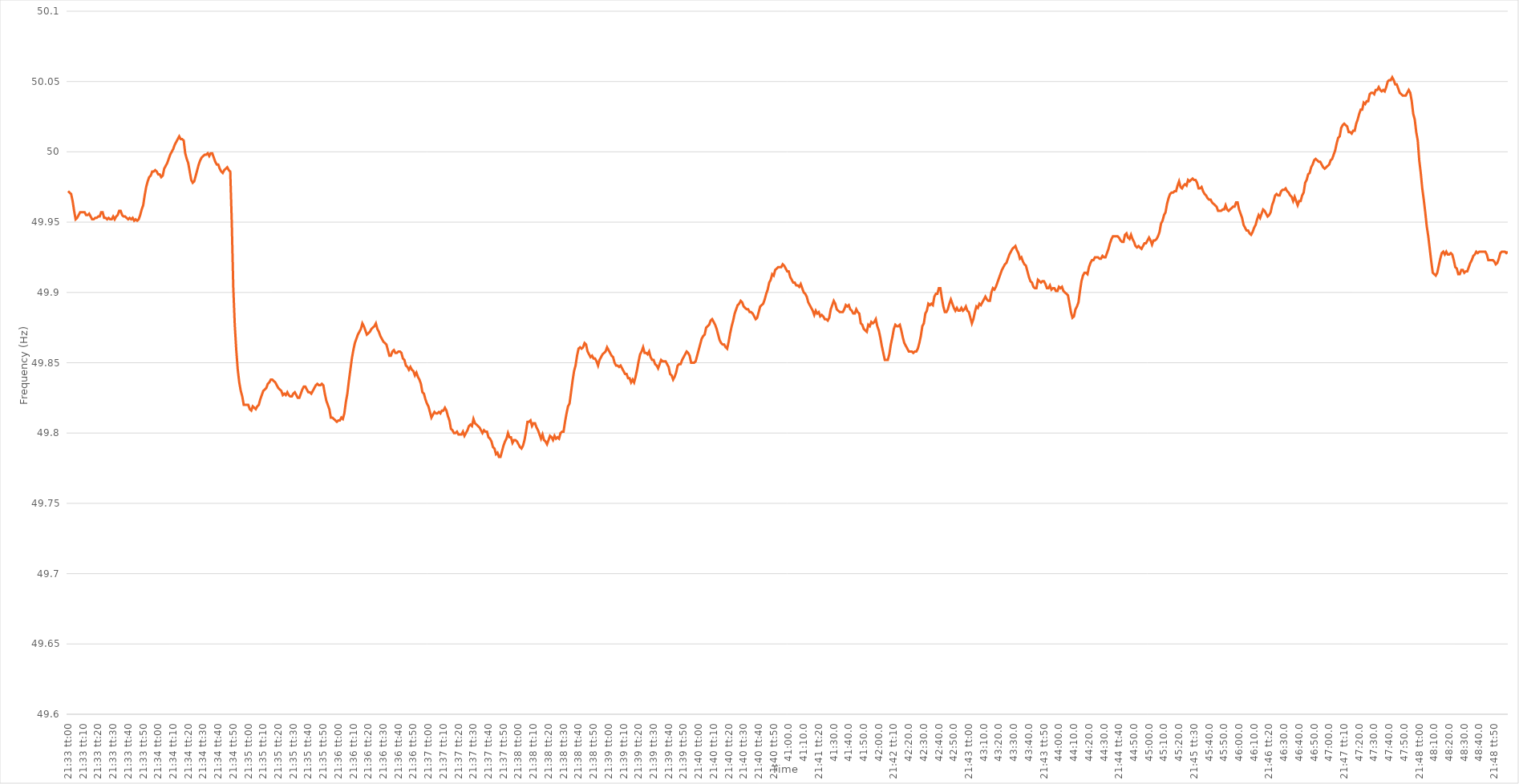
| Category | Series 0 |
|---|---|
| 0.8979166666666667 | 49.972 |
| 0.8979282407407408 | 49.971 |
| 0.8979398148148148 | 49.97 |
| 0.8979513888888889 | 49.965 |
| 0.897962962962963 | 49.958 |
| 0.897974537037037 | 49.952 |
| 0.897986111111111 | 49.953 |
| 0.8979976851851852 | 49.955 |
| 0.8980092592592593 | 49.957 |
| 0.8980208333333333 | 49.957 |
| 0.8980324074074074 | 49.957 |
| 0.8980439814814815 | 49.957 |
| 0.8980555555555556 | 49.955 |
| 0.8980671296296295 | 49.955 |
| 0.8980787037037037 | 49.956 |
| 0.8980902777777778 | 49.954 |
| 0.8981018518518519 | 49.952 |
| 0.8981134259259259 | 49.952 |
| 0.898125 | 49.953 |
| 0.8981365740740741 | 49.953 |
| 0.8981481481481483 | 49.954 |
| 0.8981597222222222 | 49.954 |
| 0.8981712962962963 | 49.957 |
| 0.8981828703703704 | 49.957 |
| 0.8981944444444444 | 49.953 |
| 0.8982060185185184 | 49.953 |
| 0.8982175925925926 | 49.952 |
| 0.8982291666666667 | 49.953 |
| 0.8982407407407407 | 49.952 |
| 0.8982523148148148 | 49.952 |
| 0.8982638888888889 | 49.954 |
| 0.898275462962963 | 49.952 |
| 0.8982870370370369 | 49.954 |
| 0.8982986111111111 | 49.955 |
| 0.8983101851851852 | 49.958 |
| 0.8983217592592593 | 49.958 |
| 0.8983333333333333 | 49.955 |
| 0.8983449074074074 | 49.954 |
| 0.8983564814814815 | 49.954 |
| 0.8983680555555557 | 49.953 |
| 0.8983796296296296 | 49.952 |
| 0.8983912037037037 | 49.953 |
| 0.8984027777777778 | 49.952 |
| 0.8984143518518519 | 49.953 |
| 0.8984259259259259 | 49.951 |
| 0.8984375 | 49.952 |
| 0.8984490740740741 | 49.951 |
| 0.8984606481481481 | 49.952 |
| 0.8984722222222222 | 49.955 |
| 0.8984837962962963 | 49.959 |
| 0.8984953703703704 | 49.962 |
| 0.8985069444444443 | 49.969 |
| 0.8985185185185185 | 49.975 |
| 0.8985300925925926 | 49.979 |
| 0.8985416666666667 | 49.982 |
| 0.8985532407407407 | 49.983 |
| 0.8985648148148148 | 49.986 |
| 0.8985763888888889 | 49.986 |
| 0.8985879629629631 | 49.987 |
| 0.898599537037037 | 49.986 |
| 0.8986111111111111 | 49.984 |
| 0.8986226851851852 | 49.984 |
| 0.8986342592592593 | 49.982 |
| 0.8986458333333333 | 49.983 |
| 0.8986574074074074 | 49.988 |
| 0.8986689814814816 | 49.99 |
| 0.8986805555555556 | 49.992 |
| 0.8986921296296296 | 49.995 |
| 0.8987037037037037 | 49.998 |
| 0.8987152777777778 | 50 |
| 0.8987268518518517 | 50.002 |
| 0.8987384259259259 | 50.005 |
| 0.89875 | 50.007 |
| 0.8987615740740741 | 50.009 |
| 0.8987731481481481 | 50.011 |
| 0.8987847222222222 | 50.009 |
| 0.8987962962962963 | 50.009 |
| 0.8988078703703705 | 50.008 |
| 0.8988194444444444 | 49.999 |
| 0.8988310185185185 | 49.995 |
| 0.8988425925925926 | 49.992 |
| 0.8988541666666667 | 49.986 |
| 0.8988657407407407 | 49.98 |
| 0.8988773148148148 | 49.978 |
| 0.898888888888889 | 49.979 |
| 0.898900462962963 | 49.983 |
| 0.898912037037037 | 49.987 |
| 0.8989236111111111 | 49.991 |
| 0.8989351851851852 | 49.994 |
| 0.8989467592592592 | 49.996 |
| 0.8989583333333333 | 49.997 |
| 0.8989699074074075 | 49.998 |
| 0.8989814814814815 | 49.998 |
| 0.8989930555555555 | 49.999 |
| 0.8990046296296296 | 49.997 |
| 0.8990162037037037 | 49.999 |
| 0.8990277777777779 | 49.999 |
| 0.8990393518518518 | 49.996 |
| 0.899050925925926 | 49.993 |
| 0.8990625 | 49.991 |
| 0.8990740740740741 | 49.991 |
| 0.8990856481481481 | 49.988 |
| 0.8990972222222222 | 49.986 |
| 0.8991087962962964 | 49.985 |
| 0.8991203703703704 | 49.987 |
| 0.8991319444444444 | 49.988 |
| 0.8991435185185185 | 49.989 |
| 0.8991550925925926 | 49.987 |
| 0.8991666666666666 | 49.986 |
| 0.8991782407407407 | 49.95 |
| 0.8991898148148149 | 49.904 |
| 0.8992013888888889 | 49.877 |
| 0.8992129629629629 | 49.859 |
| 0.899224537037037 | 49.845 |
| 0.8992361111111111 | 49.836 |
| 0.8992476851851853 | 49.83 |
| 0.8992592592592592 | 49.826 |
| 0.8992708333333334 | 49.82 |
| 0.8992824074074074 | 49.82 |
| 0.8992939814814815 | 49.82 |
| 0.8993055555555555 | 49.82 |
| 0.8993171296296296 | 49.817 |
| 0.8993287037037038 | 49.816 |
| 0.8993402777777778 | 49.819 |
| 0.8993518518518518 | 49.818 |
| 0.8993634259259259 | 49.817 |
| 0.899375 | 49.819 |
| 0.899386574074074 | 49.82 |
| 0.8993981481481481 | 49.824 |
| 0.8994097222222223 | 49.827 |
| 0.8994212962962963 | 49.83 |
| 0.8994328703703703 | 49.831 |
| 0.8994444444444444 | 49.832 |
| 0.8994560185185185 | 49.835 |
| 0.8994675925925927 | 49.836 |
| 0.8994791666666666 | 49.838 |
| 0.8994907407407408 | 49.838 |
| 0.8995023148148148 | 49.837 |
| 0.899513888888889 | 49.836 |
| 0.8995254629629629 | 49.834 |
| 0.899537037037037 | 49.832 |
| 0.8995486111111112 | 49.831 |
| 0.8995601851851852 | 49.83 |
| 0.8995717592592593 | 49.827 |
| 0.8995833333333333 | 49.828 |
| 0.8995949074074074 | 49.827 |
| 0.8996064814814814 | 49.829 |
| 0.8996180555555555 | 49.827 |
| 0.8996296296296297 | 49.826 |
| 0.8996412037037037 | 49.826 |
| 0.8996527777777777 | 49.828 |
| 0.8996643518518518 | 49.829 |
| 0.8996759259259259 | 49.827 |
| 0.8996875000000001 | 49.825 |
| 0.899699074074074 | 49.825 |
| 0.8997106481481482 | 49.828 |
| 0.8997222222222222 | 49.831 |
| 0.8997337962962964 | 49.833 |
| 0.8997453703703703 | 49.833 |
| 0.8997569444444444 | 49.831 |
| 0.8997685185185186 | 49.829 |
| 0.8997800925925926 | 49.829 |
| 0.8997916666666667 | 49.828 |
| 0.8998032407407407 | 49.83 |
| 0.8998148148148148 | 49.832 |
| 0.899826388888889 | 49.834 |
| 0.8998379629629629 | 49.835 |
| 0.8998495370370371 | 49.834 |
| 0.8998611111111111 | 49.834 |
| 0.8998726851851853 | 49.835 |
| 0.8998842592592592 | 49.834 |
| 0.8998958333333333 | 49.828 |
| 0.8999074074074075 | 49.823 |
| 0.8999189814814814 | 49.82 |
| 0.8999305555555556 | 49.817 |
| 0.8999421296296296 | 49.811 |
| 0.8999537037037038 | 49.811 |
| 0.8999652777777777 | 49.81 |
| 0.8999768518518518 | 49.809 |
| 0.899988425925926 | 49.808 |
| 0.9 | 49.809 |
| 0.9000115740740741 | 49.809 |
| 0.9000231481481481 | 49.811 |
| 0.9000347222222222 | 49.81 |
| 0.9000462962962964 | 49.814 |
| 0.9000578703703703 | 49.822 |
| 0.9000694444444445 | 49.828 |
| 0.9000810185185185 | 49.837 |
| 0.9000925925925927 | 49.845 |
| 0.9001041666666666 | 49.853 |
| 0.9001157407407407 | 49.859 |
| 0.9001273148148149 | 49.864 |
| 0.9001388888888888 | 49.867 |
| 0.900150462962963 | 49.87 |
| 0.900162037037037 | 49.872 |
| 0.9001736111111112 | 49.874 |
| 0.9001851851851851 | 49.878 |
| 0.9001967592592592 | 49.876 |
| 0.9002083333333334 | 49.873 |
| 0.9002199074074074 | 49.87 |
| 0.9002314814814815 | 49.871 |
| 0.9002430555555555 | 49.872 |
| 0.9002546296296297 | 49.874 |
| 0.9002662037037038 | 49.875 |
| 0.9002777777777777 | 49.876 |
| 0.9002893518518519 | 49.878 |
| 0.9003009259259259 | 49.874 |
| 0.9003125000000001 | 49.872 |
| 0.900324074074074 | 49.869 |
| 0.9003356481481481 | 49.867 |
| 0.9003472222222223 | 49.865 |
| 0.9003587962962962 | 49.864 |
| 0.9003703703703704 | 49.863 |
| 0.9003819444444444 | 49.859 |
| 0.9003935185185186 | 49.855 |
| 0.9004050925925925 | 49.855 |
| 0.9004166666666666 | 49.858 |
| 0.9004282407407408 | 49.859 |
| 0.9004398148148148 | 49.857 |
| 0.9004513888888889 | 49.857 |
| 0.9004629629629629 | 49.858 |
| 0.9004745370370371 | 49.858 |
| 0.9004861111111112 | 49.857 |
| 0.9004976851851851 | 49.853 |
| 0.9005092592592593 | 49.852 |
| 0.9005208333333333 | 49.848 |
| 0.9005324074074075 | 49.847 |
| 0.9005439814814814 | 49.845 |
| 0.9005555555555556 | 49.847 |
| 0.9005671296296297 | 49.845 |
| 0.9005787037037036 | 49.844 |
| 0.9005902777777778 | 49.841 |
| 0.9006018518518518 | 49.843 |
| 0.900613425925926 | 49.84 |
| 0.9006249999999999 | 49.838 |
| 0.900636574074074 | 49.835 |
| 0.9006481481481482 | 49.829 |
| 0.9006597222222222 | 49.828 |
| 0.9006712962962963 | 49.824 |
| 0.9006828703703703 | 49.821 |
| 0.9006944444444445 | 49.819 |
| 0.9007060185185186 | 49.815 |
| 0.9007175925925925 | 49.811 |
| 0.9007291666666667 | 49.813 |
| 0.9007407407407407 | 49.815 |
| 0.9007523148148149 | 49.814 |
| 0.9007638888888888 | 49.814 |
| 0.900775462962963 | 49.815 |
| 0.9007870370370371 | 49.814 |
| 0.900798611111111 | 49.816 |
| 0.9008101851851852 | 49.816 |
| 0.9008217592592592 | 49.818 |
| 0.9008333333333334 | 49.816 |
| 0.9008449074074073 | 49.812 |
| 0.9008564814814815 | 49.809 |
| 0.9008680555555556 | 49.803 |
| 0.9008796296296296 | 49.802 |
| 0.9008912037037037 | 49.8 |
| 0.9009027777777777 | 49.8 |
| 0.9009143518518519 | 49.801 |
| 0.900925925925926 | 49.799 |
| 0.9009375 | 49.799 |
| 0.9009490740740741 | 49.799 |
| 0.9009606481481481 | 49.801 |
| 0.9009722222222223 | 49.798 |
| 0.9009837962962962 | 49.8 |
| 0.9009953703703704 | 49.802 |
| 0.9010069444444445 | 49.805 |
| 0.9010185185185186 | 49.806 |
| 0.9010300925925926 | 49.805 |
| 0.9010416666666666 | 49.81 |
| 0.9010532407407408 | 49.807 |
| 0.9010648148148147 | 49.806 |
| 0.9010763888888889 | 49.805 |
| 0.901087962962963 | 49.804 |
| 0.901099537037037 | 49.802 |
| 0.9011111111111111 | 49.8 |
| 0.9011226851851851 | 49.802 |
| 0.9011342592592593 | 49.801 |
| 0.9011458333333334 | 49.801 |
| 0.9011574074074074 | 49.797 |
| 0.9011689814814815 | 49.796 |
| 0.9011805555555555 | 49.794 |
| 0.9011921296296297 | 49.79 |
| 0.9012037037037036 | 49.789 |
| 0.9012152777777778 | 49.785 |
| 0.9012268518518519 | 49.786 |
| 0.901238425925926 | 49.783 |
| 0.90125 | 49.783 |
| 0.901261574074074 | 49.787 |
| 0.9012731481481482 | 49.791 |
| 0.9012847222222223 | 49.794 |
| 0.9012962962962963 | 49.796 |
| 0.9013078703703704 | 49.8 |
| 0.9013194444444445 | 49.797 |
| 0.9013310185185185 | 49.797 |
| 0.9013425925925925 | 49.793 |
| 0.9013541666666667 | 49.795 |
| 0.9013657407407408 | 49.795 |
| 0.9013773148148148 | 49.794 |
| 0.9013888888888889 | 49.792 |
| 0.901400462962963 | 49.79 |
| 0.9014120370370371 | 49.789 |
| 0.901423611111111 | 49.791 |
| 0.9014351851851852 | 49.795 |
| 0.9014467592592593 | 49.801 |
| 0.9014583333333334 | 49.808 |
| 0.9014699074074074 | 49.808 |
| 0.9014814814814814 | 49.809 |
| 0.9014930555555556 | 49.805 |
| 0.9015046296296297 | 49.807 |
| 0.9015162037037037 | 49.807 |
| 0.9015277777777778 | 49.804 |
| 0.9015393518518519 | 49.802 |
| 0.9015509259259259 | 49.799 |
| 0.9015624999999999 | 49.796 |
| 0.9015740740740741 | 49.799 |
| 0.9015856481481482 | 49.795 |
| 0.9015972222222222 | 49.794 |
| 0.9016087962962963 | 49.792 |
| 0.9016203703703703 | 49.795 |
| 0.9016319444444445 | 49.798 |
| 0.9016435185185184 | 49.797 |
| 0.9016550925925926 | 49.795 |
| 0.9016666666666667 | 49.798 |
| 0.9016782407407408 | 49.796 |
| 0.9016898148148148 | 49.797 |
| 0.9017013888888888 | 49.796 |
| 0.901712962962963 | 49.8 |
| 0.9017245370370371 | 49.801 |
| 0.9017361111111111 | 49.801 |
| 0.9017476851851852 | 49.808 |
| 0.9017592592592593 | 49.814 |
| 0.9017708333333333 | 49.819 |
| 0.9017824074074073 | 49.821 |
| 0.9017939814814815 | 49.829 |
| 0.9018055555555556 | 49.837 |
| 0.9018171296296296 | 49.844 |
| 0.9018287037037037 | 49.848 |
| 0.9018402777777778 | 49.855 |
| 0.9018518518518519 | 49.86 |
| 0.9018634259259258 | 49.861 |
| 0.901875 | 49.86 |
| 0.9018865740740741 | 49.861 |
| 0.9018981481481482 | 49.864 |
| 0.9019097222222222 | 49.863 |
| 0.9019212962962962 | 49.858 |
| 0.9019328703703704 | 49.856 |
| 0.9019444444444445 | 49.854 |
| 0.9019560185185185 | 49.855 |
| 0.9019675925925926 | 49.853 |
| 0.9019791666666667 | 49.853 |
| 0.9019907407407407 | 49.851 |
| 0.9020023148148147 | 49.848 |
| 0.9020138888888889 | 49.852 |
| 0.902025462962963 | 49.854 |
| 0.902037037037037 | 49.856 |
| 0.9020486111111111 | 49.857 |
| 0.9020601851851852 | 49.858 |
| 0.9020717592592593 | 49.861 |
| 0.9020833333333332 | 49.859 |
| 0.9020949074074074 | 49.857 |
| 0.9021064814814815 | 49.855 |
| 0.9021180555555556 | 49.854 |
| 0.9021296296296296 | 49.85 |
| 0.9021412037037037 | 49.848 |
| 0.9021527777777778 | 49.848 |
| 0.902164351851852 | 49.847 |
| 0.9021759259259259 | 49.848 |
| 0.9021875 | 49.846 |
| 0.9021990740740741 | 49.844 |
| 0.9022106481481481 | 49.842 |
| 0.9022222222222221 | 49.842 |
| 0.9022337962962963 | 49.839 |
| 0.9022453703703704 | 49.839 |
| 0.9022569444444444 | 49.836 |
| 0.9022685185185185 | 49.838 |
| 0.9022800925925926 | 49.836 |
| 0.9022916666666667 | 49.84 |
| 0.9023032407407406 | 49.845 |
| 0.9023148148148148 | 49.851 |
| 0.9023263888888889 | 49.856 |
| 0.902337962962963 | 49.858 |
| 0.902349537037037 | 49.861 |
| 0.9023611111111111 | 49.857 |
| 0.9023726851851852 | 49.857 |
| 0.9023842592592594 | 49.856 |
| 0.9023958333333333 | 49.858 |
| 0.9024074074074074 | 49.854 |
| 0.9024189814814815 | 49.852 |
| 0.9024305555555556 | 49.852 |
| 0.9024421296296296 | 49.849 |
| 0.9024537037037037 | 49.848 |
| 0.9024652777777779 | 49.846 |
| 0.9024768518518519 | 49.849 |
| 0.9024884259259259 | 49.852 |
| 0.9025 | 49.851 |
| 0.9025115740740741 | 49.851 |
| 0.902523148148148 | 49.851 |
| 0.9025347222222222 | 49.849 |
| 0.9025462962962963 | 49.847 |
| 0.9025578703703704 | 49.842 |
| 0.9025694444444444 | 49.841 |
| 0.9025810185185185 | 49.838 |
| 0.9025925925925926 | 49.84 |
| 0.9026041666666668 | 49.843 |
| 0.9026157407407407 | 49.848 |
| 0.9026273148148148 | 49.849 |
| 0.9026388888888889 | 49.849 |
| 0.902650462962963 | 49.852 |
| 0.902662037037037 | 49.854 |
| 0.9026736111111111 | 49.856 |
| 0.9026851851851853 | 49.858 |
| 0.9026967592592593 | 49.857 |
| 0.9027083333333333 | 49.855 |
| 0.9027199074074074 | 49.85 |
| 0.9027314814814815 | 49.85 |
| 0.9027430555555555 | 49.85 |
| 0.9027546296296296 | 49.851 |
| 0.9027662037037038 | 49.855 |
| 0.9027777777777778 | 49.859 |
| 0.9027893518518518 | 49.863 |
| 0.9028009259259259 | 49.867 |
| 0.9028125 | 49.869 |
| 0.9028240740740742 | 49.87 |
| 0.9028356481481481 | 49.875 |
| 0.9028472222222222 | 49.876 |
| 0.9028587962962963 | 49.877 |
| 0.9028703703703704 | 49.88 |
| 0.9028819444444444 | 49.881 |
| 0.9028935185185185 | 49.879 |
| 0.9029050925925927 | 49.877 |
| 0.9029166666666667 | 49.874 |
| 0.9029282407407407 | 49.87 |
| 0.9029398148148148 | 49.866 |
| 0.9029513888888889 | 49.864 |
| 0.9029629629629629 | 49.863 |
| 0.902974537037037 | 49.863 |
| 0.9029861111111112 | 49.861 |
| 0.9029976851851852 | 49.86 |
| 0.9030092592592592 | 49.865 |
| 0.9030208333333333 | 49.871 |
| 0.9030324074074074 | 49.876 |
| 0.9030439814814816 | 49.88 |
| 0.9030555555555555 | 49.885 |
| 0.9030671296296297 | 49.888 |
| 0.9030787037037037 | 49.891 |
| 0.9030902777777778 | 49.892 |
| 0.9031018518518518 | 49.894 |
| 0.9031134259259259 | 49.893 |
| 0.9031250000000001 | 49.89 |
| 0.9031365740740741 | 49.889 |
| 0.9031481481481481 | 49.888 |
| 0.9031597222222222 | 49.888 |
| 0.9031712962962963 | 49.886 |
| 0.9031828703703703 | 49.886 |
| 0.9031944444444444 | 49.885 |
| 0.9032060185185186 | 49.883 |
| 0.9032175925925926 | 49.881 |
| 0.9032291666666666 | 49.882 |
| 0.9032407407407407 | 49.886 |
| 0.9032523148148148 | 49.89 |
| 0.903263888888889 | 49.891 |
| 0.9032754629629629 | 49.892 |
| 0.903287037037037 | 49.895 |
| 0.9032986111111111 | 49.899 |
| 0.9033101851851852 | 49.902 |
| 0.9033217592592592 | 49.907 |
| 0.9033333333333333 | 49.909 |
| 0.9033449074074075 | 49.913 |
| 0.9033564814814815 | 49.912 |
| 0.9033680555555555 | 49.916 |
| 0.9033796296296296 | 49.917 |
| 0.9033912037037037 | 49.918 |
| 0.9034027777777777 | 49.918 |
| 0.9034143518518518 | 49.918 |
| 0.903425925925926 | 49.92 |
| 0.9034375 | 49.919 |
| 0.903449074074074 | 49.917 |
| 0.9034606481481481 | 49.915 |
| 0.9034722222222222 | 49.915 |
| 0.9034837962962964 | 49.911 |
| 0.9034953703703703 | 49.909 |
| 0.9035069444444445 | 49.907 |
| 0.9035185185185185 | 49.907 |
| 0.9035300925925926 | 49.905 |
| 0.9035416666666666 | 49.905 |
| 0.9035532407407407 | 49.904 |
| 0.9035648148148149 | 49.906 |
| 0.9035763888888889 | 49.903 |
| 0.903587962962963 | 49.9 |
| 0.903599537037037 | 49.899 |
| 0.9036111111111111 | 49.897 |
| 0.9036226851851853 | 49.893 |
| 0.9036342592592592 | 49.891 |
| 0.9036458333333334 | 49.889 |
| 0.9036574074074074 | 49.887 |
| 0.9036689814814814 | 49.884 |
| 0.9036805555555555 | 49.887 |
| 0.9036921296296296 | 49.885 |
| 0.9037037037037038 | 49.886 |
| 0.9037152777777777 | 49.883 |
| 0.9037268518518519 | 49.884 |
| 0.9037384259259259 | 49.883 |
| 0.90375 | 49.881 |
| 0.903761574074074 | 49.881 |
| 0.9037731481481481 | 49.88 |
| 0.9037847222222223 | 49.882 |
| 0.9037962962962963 | 49.888 |
| 0.9038078703703704 | 49.891 |
| 0.9038194444444444 | 49.894 |
| 0.9038310185185185 | 49.892 |
| 0.9038425925925927 | 49.888 |
| 0.9038541666666666 | 49.887 |
| 0.9038657407407408 | 49.886 |
| 0.9038773148148148 | 49.886 |
| 0.903888888888889 | 49.886 |
| 0.9039004629629629 | 49.888 |
| 0.903912037037037 | 49.891 |
| 0.9039236111111112 | 49.89 |
| 0.9039351851851851 | 49.891 |
| 0.9039467592592593 | 49.888 |
| 0.9039583333333333 | 49.887 |
| 0.9039699074074075 | 49.885 |
| 0.9039814814814814 | 49.885 |
| 0.9039930555555555 | 49.888 |
| 0.9040046296296297 | 49.886 |
| 0.9040162037037037 | 49.885 |
| 0.9040277777777778 | 49.878 |
| 0.9040393518518518 | 49.877 |
| 0.904050925925926 | 49.874 |
| 0.9040625000000001 | 49.873 |
| 0.904074074074074 | 49.872 |
| 0.9040856481481482 | 49.877 |
| 0.9040972222222222 | 49.876 |
| 0.9041087962962964 | 49.879 |
| 0.9041203703703703 | 49.878 |
| 0.9041319444444444 | 49.879 |
| 0.9041435185185186 | 49.881 |
| 0.9041550925925925 | 49.876 |
| 0.9041666666666667 | 49.873 |
| 0.9041782407407407 | 49.868 |
| 0.9041898148148149 | 49.862 |
| 0.9042013888888888 | 49.857 |
| 0.9042129629629629 | 49.852 |
| 0.9042245370370371 | 49.852 |
| 0.9042361111111111 | 49.852 |
| 0.9042476851851852 | 49.856 |
| 0.9042592592592592 | 49.863 |
| 0.9042708333333334 | 49.868 |
| 0.9042824074074075 | 49.874 |
| 0.9042939814814814 | 49.877 |
| 0.9043055555555556 | 49.876 |
| 0.9043171296296296 | 49.876 |
| 0.9043287037037038 | 49.877 |
| 0.9043402777777777 | 49.873 |
| 0.9043518518518519 | 49.868 |
| 0.904363425925926 | 49.864 |
| 0.9043749999999999 | 49.862 |
| 0.9043865740740741 | 49.86 |
| 0.9043981481481481 | 49.858 |
| 0.9044097222222223 | 49.858 |
| 0.9044212962962962 | 49.858 |
| 0.9044328703703703 | 49.857 |
| 0.9044444444444445 | 49.858 |
| 0.9044560185185185 | 49.858 |
| 0.9044675925925926 | 49.86 |
| 0.9044791666666666 | 49.864 |
| 0.9044907407407408 | 49.869 |
| 0.9045023148148149 | 49.876 |
| 0.9045138888888888 | 49.878 |
| 0.904525462962963 | 49.885 |
| 0.904537037037037 | 49.887 |
| 0.9045486111111112 | 49.892 |
| 0.9045601851851851 | 49.891 |
| 0.9045717592592593 | 49.892 |
| 0.9045833333333334 | 49.891 |
| 0.9045949074074073 | 49.897 |
| 0.9046064814814815 | 49.899 |
| 0.9046180555555555 | 49.899 |
| 0.9046296296296297 | 49.903 |
| 0.9046412037037036 | 49.903 |
| 0.9046527777777778 | 49.896 |
| 0.9046643518518519 | 49.89 |
| 0.9046759259259259 | 49.886 |
| 0.9046875 | 49.886 |
| 0.904699074074074 | 49.888 |
| 0.9047106481481482 | 49.892 |
| 0.9047222222222223 | 49.895 |
| 0.9047337962962962 | 49.892 |
| 0.9047453703703704 | 49.889 |
| 0.9047569444444444 | 49.887 |
| 0.9047685185185186 | 49.889 |
| 0.9047800925925925 | 49.887 |
| 0.9047916666666667 | 49.887 |
| 0.9048032407407408 | 49.889 |
| 0.9048148148148147 | 49.887 |
| 0.9048263888888889 | 49.888 |
| 0.9048379629629629 | 49.89 |
| 0.9048495370370371 | 49.887 |
| 0.904861111111111 | 49.886 |
| 0.9048726851851852 | 49.882 |
| 0.9048842592592593 | 49.878 |
| 0.9048958333333333 | 49.881 |
| 0.9049074074074074 | 49.886 |
| 0.9049189814814814 | 49.89 |
| 0.9049305555555556 | 49.889 |
| 0.9049421296296297 | 49.892 |
| 0.9049537037037036 | 49.891 |
| 0.9049652777777778 | 49.893 |
| 0.9049768518518518 | 49.895 |
| 0.904988425925926 | 49.897 |
| 0.9049999999999999 | 49.895 |
| 0.9050115740740741 | 49.894 |
| 0.9050231481481482 | 49.894 |
| 0.9050347222222223 | 49.9 |
| 0.9050462962962963 | 49.903 |
| 0.9050578703703703 | 49.902 |
| 0.9050694444444445 | 49.904 |
| 0.9050810185185186 | 49.907 |
| 0.9050925925925926 | 49.91 |
| 0.9051041666666667 | 49.913 |
| 0.9051157407407407 | 49.916 |
| 0.9051273148148148 | 49.918 |
| 0.9051388888888888 | 49.92 |
| 0.905150462962963 | 49.921 |
| 0.9051620370370371 | 49.924 |
| 0.905173611111111 | 49.927 |
| 0.9051851851851852 | 49.929 |
| 0.9051967592592592 | 49.931 |
| 0.9052083333333334 | 49.932 |
| 0.9052199074074073 | 49.933 |
| 0.9052314814814815 | 49.93 |
| 0.9052430555555556 | 49.928 |
| 0.9052546296296297 | 49.924 |
| 0.9052662037037037 | 49.925 |
| 0.9052777777777777 | 49.922 |
| 0.9052893518518519 | 49.92 |
| 0.905300925925926 | 49.919 |
| 0.9053125 | 49.915 |
| 0.9053240740740741 | 49.911 |
| 0.9053356481481482 | 49.908 |
| 0.9053472222222222 | 49.907 |
| 0.9053587962962962 | 49.904 |
| 0.9053703703703704 | 49.903 |
| 0.9053819444444445 | 49.903 |
| 0.9053935185185185 | 49.909 |
| 0.9054050925925926 | 49.908 |
| 0.9054166666666666 | 49.907 |
| 0.9054282407407408 | 49.908 |
| 0.9054398148148147 | 49.908 |
| 0.9054513888888889 | 49.906 |
| 0.905462962962963 | 49.903 |
| 0.9054745370370371 | 49.903 |
| 0.9054861111111111 | 49.905 |
| 0.9054976851851851 | 49.902 |
| 0.9055092592592593 | 49.903 |
| 0.9055208333333334 | 49.903 |
| 0.9055324074074074 | 49.901 |
| 0.9055439814814815 | 49.901 |
| 0.9055555555555556 | 49.904 |
| 0.9055671296296296 | 49.903 |
| 0.9055787037037036 | 49.904 |
| 0.9055902777777778 | 49.901 |
| 0.9056018518518519 | 49.9 |
| 0.9056134259259259 | 49.899 |
| 0.905625 | 49.898 |
| 0.905636574074074 | 49.892 |
| 0.9056481481481482 | 49.886 |
| 0.9056597222222221 | 49.882 |
| 0.9056712962962963 | 49.883 |
| 0.9056828703703704 | 49.888 |
| 0.9056944444444445 | 49.89 |
| 0.9057060185185185 | 49.893 |
| 0.9057175925925925 | 49.901 |
| 0.9057291666666667 | 49.908 |
| 0.9057407407407408 | 49.912 |
| 0.9057523148148148 | 49.914 |
| 0.9057638888888889 | 49.914 |
| 0.905775462962963 | 49.913 |
| 0.905787037037037 | 49.918 |
| 0.905798611111111 | 49.921 |
| 0.9058101851851852 | 49.923 |
| 0.9058217592592593 | 49.923 |
| 0.9058333333333333 | 49.925 |
| 0.9058449074074074 | 49.925 |
| 0.9058564814814815 | 49.925 |
| 0.9058680555555556 | 49.924 |
| 0.9058796296296295 | 49.924 |
| 0.9058912037037037 | 49.926 |
| 0.9059027777777778 | 49.925 |
| 0.9059143518518519 | 49.925 |
| 0.9059259259259259 | 49.928 |
| 0.9059375 | 49.931 |
| 0.9059490740740741 | 49.935 |
| 0.9059606481481483 | 49.938 |
| 0.9059722222222222 | 49.94 |
| 0.9059837962962963 | 49.94 |
| 0.9059953703703704 | 49.94 |
| 0.9060069444444444 | 49.94 |
| 0.9060185185185184 | 49.939 |
| 0.9060300925925926 | 49.937 |
| 0.9060416666666667 | 49.936 |
| 0.9060532407407407 | 49.936 |
| 0.9060648148148148 | 49.941 |
| 0.9060763888888889 | 49.942 |
| 0.906087962962963 | 49.939 |
| 0.9060995370370369 | 49.938 |
| 0.9061111111111111 | 49.941 |
| 0.9061226851851852 | 49.938 |
| 0.9061342592592593 | 49.936 |
| 0.9061458333333333 | 49.933 |
| 0.9061574074074074 | 49.932 |
| 0.9061689814814815 | 49.933 |
| 0.9061805555555557 | 49.932 |
| 0.9061921296296296 | 49.931 |
| 0.9062037037037037 | 49.933 |
| 0.9062152777777778 | 49.935 |
| 0.9062268518518519 | 49.935 |
| 0.9062384259259259 | 49.937 |
| 0.90625 | 49.939 |
| 0.9062615740740741 | 49.937 |
| 0.9062731481481481 | 49.934 |
| 0.9062847222222222 | 49.937 |
| 0.9062962962962963 | 49.937 |
| 0.9063078703703704 | 49.938 |
| 0.9063194444444443 | 49.94 |
| 0.9063310185185185 | 49.943 |
| 0.9063425925925926 | 49.949 |
| 0.9063541666666667 | 49.951 |
| 0.9063657407407407 | 49.955 |
| 0.9063773148148148 | 49.957 |
| 0.9063888888888889 | 49.963 |
| 0.9064004629629631 | 49.967 |
| 0.906412037037037 | 49.97 |
| 0.9064236111111111 | 49.971 |
| 0.9064351851851852 | 49.971 |
| 0.9064467592592593 | 49.972 |
| 0.9064583333333333 | 49.972 |
| 0.9064699074074074 | 49.976 |
| 0.9064814814814816 | 49.979 |
| 0.9064930555555556 | 49.975 |
| 0.9065046296296296 | 49.974 |
| 0.9065162037037037 | 49.976 |
| 0.9065277777777778 | 49.977 |
| 0.9065393518518517 | 49.976 |
| 0.9065509259259259 | 49.98 |
| 0.9065625 | 49.979 |
| 0.9065740740740741 | 49.98 |
| 0.9065856481481481 | 49.981 |
| 0.9065972222222222 | 49.98 |
| 0.9066087962962963 | 49.98 |
| 0.9066203703703705 | 49.978 |
| 0.9066319444444444 | 49.974 |
| 0.9066435185185185 | 49.974 |
| 0.9066550925925926 | 49.975 |
| 0.9066666666666667 | 49.972 |
| 0.9066782407407407 | 49.97 |
| 0.9066898148148148 | 49.969 |
| 0.906701388888889 | 49.967 |
| 0.906712962962963 | 49.966 |
| 0.906724537037037 | 49.966 |
| 0.9067361111111111 | 49.964 |
| 0.9067476851851852 | 49.963 |
| 0.9067592592592592 | 49.962 |
| 0.9067708333333333 | 49.961 |
| 0.9067824074074075 | 49.958 |
| 0.9067939814814815 | 49.958 |
| 0.9068055555555555 | 49.958 |
| 0.9068171296296296 | 49.959 |
| 0.9068287037037037 | 49.959 |
| 0.9068402777777779 | 49.962 |
| 0.9068518518518518 | 49.959 |
| 0.906863425925926 | 49.958 |
| 0.906875 | 49.959 |
| 0.9068865740740741 | 49.96 |
| 0.9068981481481481 | 49.961 |
| 0.9069097222222222 | 49.961 |
| 0.9069212962962964 | 49.964 |
| 0.9069328703703704 | 49.964 |
| 0.9069444444444444 | 49.959 |
| 0.9069560185185185 | 49.956 |
| 0.9069675925925926 | 49.953 |
| 0.9069791666666666 | 49.948 |
| 0.9069907407407407 | 49.946 |
| 0.9070023148148149 | 49.944 |
| 0.9070138888888889 | 49.944 |
| 0.9070254629629629 | 49.942 |
| 0.907037037037037 | 49.941 |
| 0.9070486111111111 | 49.943 |
| 0.9070601851851853 | 49.946 |
| 0.9070717592592592 | 49.948 |
| 0.9070833333333334 | 49.952 |
| 0.9070949074074074 | 49.955 |
| 0.9071064814814815 | 49.953 |
| 0.9071180555555555 | 49.956 |
| 0.9071296296296296 | 49.959 |
| 0.9071412037037038 | 49.958 |
| 0.9071527777777778 | 49.956 |
| 0.9071643518518518 | 49.954 |
| 0.9071759259259259 | 49.955 |
| 0.9071875 | 49.957 |
| 0.907199074074074 | 49.962 |
| 0.9072106481481481 | 49.965 |
| 0.9072222222222223 | 49.969 |
| 0.9072337962962963 | 49.97 |
| 0.9072453703703703 | 49.969 |
| 0.9072569444444444 | 49.969 |
| 0.9072685185185185 | 49.972 |
| 0.9072800925925927 | 49.973 |
| 0.9072916666666666 | 49.973 |
| 0.9073032407407408 | 49.974 |
| 0.9073148148148148 | 49.972 |
| 0.907326388888889 | 49.971 |
| 0.9073379629629629 | 49.969 |
| 0.907349537037037 | 49.968 |
| 0.9073611111111112 | 49.965 |
| 0.9073726851851852 | 49.968 |
| 0.9073842592592593 | 49.965 |
| 0.9073958333333333 | 49.962 |
| 0.9074074074074074 | 49.965 |
| 0.9074189814814814 | 49.965 |
| 0.9074305555555555 | 49.969 |
| 0.9074421296296297 | 49.971 |
| 0.9074537037037037 | 49.978 |
| 0.9074652777777777 | 49.98 |
| 0.9074768518518518 | 49.984 |
| 0.9074884259259259 | 49.985 |
| 0.9075000000000001 | 49.989 |
| 0.907511574074074 | 49.991 |
| 0.9075231481481482 | 49.994 |
| 0.9075347222222222 | 49.995 |
| 0.9075462962962964 | 49.994 |
| 0.9075578703703703 | 49.993 |
| 0.9075694444444444 | 49.993 |
| 0.9075810185185186 | 49.991 |
| 0.9075925925925926 | 49.989 |
| 0.9076041666666667 | 49.988 |
| 0.9076157407407407 | 49.989 |
| 0.9076273148148148 | 49.99 |
| 0.907638888888889 | 49.991 |
| 0.9076504629629629 | 49.994 |
| 0.9076620370370371 | 49.995 |
| 0.9076736111111111 | 49.998 |
| 0.9076851851851853 | 50.001 |
| 0.9076967592592592 | 50.006 |
| 0.9077083333333333 | 50.01 |
| 0.9077199074074075 | 50.011 |
| 0.9077314814814814 | 50.017 |
| 0.9077430555555556 | 50.019 |
| 0.9077546296296296 | 50.02 |
| 0.9077662037037038 | 50.019 |
| 0.9077777777777777 | 50.018 |
| 0.9077893518518518 | 50.014 |
| 0.907800925925926 | 50.014 |
| 0.9078125 | 50.013 |
| 0.9078240740740741 | 50.015 |
| 0.9078356481481481 | 50.015 |
| 0.9078472222222222 | 50.02 |
| 0.9078587962962964 | 50.023 |
| 0.9078703703703703 | 50.027 |
| 0.9078819444444445 | 50.03 |
| 0.9078935185185185 | 50.03 |
| 0.9079050925925927 | 50.035 |
| 0.9079166666666666 | 50.034 |
| 0.9079282407407407 | 50.036 |
| 0.9079398148148149 | 50.036 |
| 0.9079513888888888 | 50.041 |
| 0.907962962962963 | 50.042 |
| 0.907974537037037 | 50.042 |
| 0.9079861111111112 | 50.041 |
| 0.9079976851851851 | 50.044 |
| 0.9080092592592592 | 50.044 |
| 0.9080208333333334 | 50.046 |
| 0.9080324074074074 | 50.044 |
| 0.9080439814814815 | 50.043 |
| 0.9080555555555555 | 50.044 |
| 0.9080671296296297 | 50.043 |
| 0.9080787037037038 | 50.046 |
| 0.9080902777777777 | 50.05 |
| 0.9081018518518519 | 50.051 |
| 0.9081134259259259 | 50.051 |
| 0.9081250000000001 | 50.053 |
| 0.908136574074074 | 50.051 |
| 0.9081481481481481 | 50.048 |
| 0.9081597222222223 | 50.048 |
| 0.9081712962962962 | 50.045 |
| 0.9081828703703704 | 50.042 |
| 0.9081944444444444 | 50.041 |
| 0.9082060185185186 | 50.04 |
| 0.9082175925925925 | 50.04 |
| 0.9082291666666666 | 50.04 |
| 0.9082407407407408 | 50.042 |
| 0.9082523148148148 | 50.044 |
| 0.9082638888888889 | 50.042 |
| 0.9082754629629629 | 50.036 |
| 0.9082870370370371 | 50.027 |
| 0.9082986111111112 | 50.023 |
| 0.9083101851851851 | 50.014 |
| 0.9083217592592593 | 50.008 |
| 0.9083333333333333 | 49.994 |
| 0.9083449074074075 | 49.985 |
| 0.9083564814814814 | 49.974 |
| 0.9083680555555556 | 49.966 |
| 0.9083796296296297 | 49.957 |
| 0.9083912037037036 | 49.947 |
| 0.9084027777777778 | 49.94 |
| 0.9084143518518518 | 49.931 |
| 0.908425925925926 | 49.922 |
| 0.9084374999999999 | 49.914 |
| 0.908449074074074 | 49.913 |
| 0.9084606481481482 | 49.912 |
| 0.9084722222222222 | 49.914 |
| 0.9084837962962963 | 49.919 |
| 0.9084953703703703 | 49.924 |
| 0.9085069444444445 | 49.928 |
| 0.9085185185185186 | 49.929 |
| 0.9085300925925925 | 49.927 |
| 0.9085416666666667 | 49.929 |
| 0.9085532407407407 | 49.927 |
| 0.9085648148148149 | 49.927 |
| 0.9085763888888888 | 49.928 |
| 0.908587962962963 | 49.927 |
| 0.9085995370370371 | 49.923 |
| 0.908611111111111 | 49.918 |
| 0.9086226851851852 | 49.917 |
| 0.9086342592592592 | 49.913 |
| 0.9086458333333334 | 49.913 |
| 0.9086574074074073 | 49.916 |
| 0.9086689814814815 | 49.916 |
| 0.9086805555555556 | 49.914 |
| 0.9086921296296296 | 49.915 |
| 0.9087037037037037 | 49.915 |
| 0.9087152777777777 | 49.918 |
| 0.9087268518518519 | 49.921 |
| 0.908738425925926 | 49.923 |
| 0.90875 | 49.926 |
| 0.9087615740740741 | 49.927 |
| 0.9087731481481481 | 49.929 |
| 0.9087847222222223 | 49.928 |
| 0.9087962962962962 | 49.929 |
| 0.9088078703703704 | 49.929 |
| 0.9088194444444445 | 49.929 |
| 0.9088310185185186 | 49.929 |
| 0.9088425925925926 | 49.929 |
| 0.9088541666666666 | 49.927 |
| 0.9088657407407408 | 49.923 |
| 0.9088773148148147 | 49.923 |
| 0.9088888888888889 | 49.923 |
| 0.908900462962963 | 49.923 |
| 0.908912037037037 | 49.922 |
| 0.9089236111111111 | 49.92 |
| 0.9089351851851851 | 49.921 |
| 0.9089467592592593 | 49.924 |
| 0.9089583333333334 | 49.928 |
| 0.9089699074074074 | 49.929 |
| 0.9089814814814815 | 49.929 |
| 0.9089930555555555 | 49.929 |
| 0.9090046296296297 | 49.928 |
| 0.9090162037037036 | 49.929 |